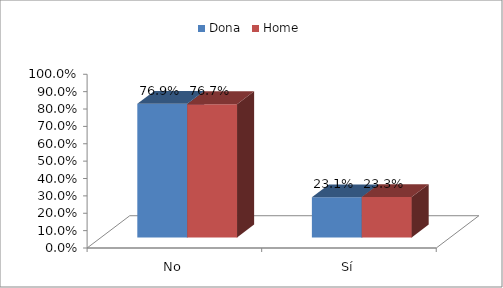
| Category | Dona | Home |
|---|---|---|
| No | 0.769 | 0.767 |
| Sí | 0.231 | 0.233 |